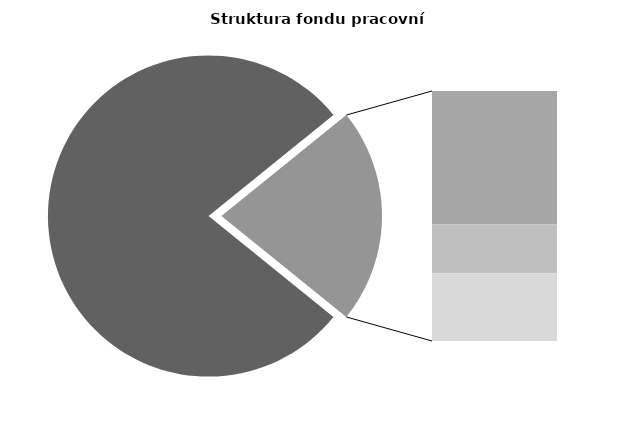
| Category | Series 0 |
|---|---|
| Průměrná měsíční odpracovaná doba bez přesčasu | 135.406 |
| Dovolená | 19.943 |
| Nemoc | 7.303 |
| Jiné | 10.147 |